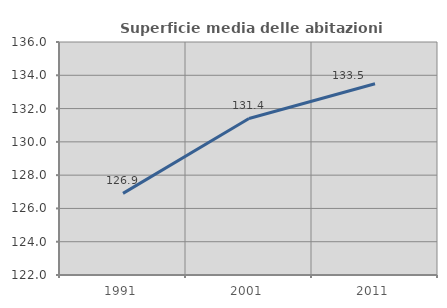
| Category | Superficie media delle abitazioni occupate |
|---|---|
| 1991.0 | 126.905 |
| 2001.0 | 131.403 |
| 2011.0 | 133.493 |